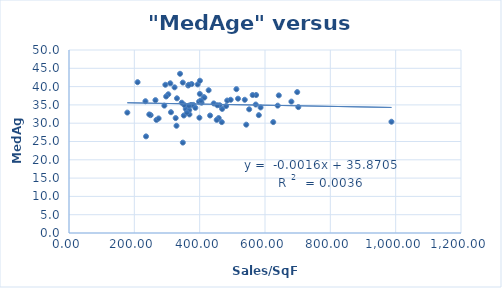
| Category | MedAge |
|---|---|
| 701.97 | 34.4 |
| 209.93 | 41.2 |
| 364.92 | 40.3 |
| 443.04 | 35.4 |
| 399.2 | 31.5 |
| 264.64 | 36.3 |
| 571.59 | 35.1 |
| 642.25 | 37.6 |
| 461.45 | 34.9 |
| 638.82 | 34.8 |
| 484.38 | 36.2 |
| 581.09 | 32.2 |
| 267.71 | 30.9 |
| 572.84 | 37.7 |
| 586.48 | 34.3 |
| 368.73 | 32.4 |
| 351.47 | 32.1 |
| 458.24 | 31.4 |
| 987.12 | 30.4 |
| 357.45 | 33.9 |
| 405.77 | 35.6 |
| 680.8 | 35.9 |
| 368.02 | 33.6 |
| 303.95 | 37.9 |
| 393.9 | 40.6 |
| 562.12 | 37.7 |
| 494.88 | 36.4 |
| 310.07 | 40.9 |
| 373.46 | 35 |
| 235.81 | 26.4 |
| 413.08 | 37.1 |
| 625.22 | 30.3 |
| 274.3 | 31.3 |
| 542.62 | 29.6 |
| 178.56 | 32.9 |
| 375.33 | 40.7 |
| 329.09 | 29.3 |
| 297.37 | 37.3 |
| 323.17 | 39.8 |
| 468.84 | 33.9 |
| 352.57 | 35 |
| 380.34 | 35 |
| 398.12 | 35.9 |
| 312.15 | 33 |
| 452.16 | 30.9 |
| 698.64 | 38.5 |
| 367.19 | 40.5 |
| 431.93 | 32.1 |
| 367.06 | 34.8 |
| 400.53 | 38 |
| 414.36 | 37 |
| 481.11 | 34.7 |
| 538.06 | 36.4 |
| 330.48 | 36.8 |
| 249.93 | 32.2 |
| 291.87 | 34.8 |
| 517.4 | 36.7 |
| 551.58 | 33.8 |
| 386.81 | 34.2 |
| 427.5 | 39 |
| 453.94 | 34.9 |
| 512.46 | 39.3 |
| 345.27 | 35.6 |
| 234.04 | 36 |
| 348.33 | 41.1 |
| 348.47 | 24.7 |
| 294.95 | 40.5 |
| 361.14 | 32.9 |
| 467.71 | 30.3 |
| 403.78 | 36.2 |
| 245.74 | 32.4 |
| 339.94 | 43.5 |
| 400.82 | 41.6 |
| 326.54 | 31.4 |